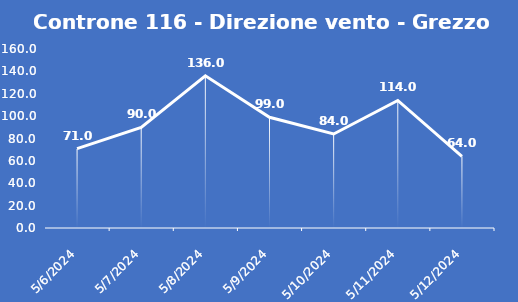
| Category | Controne 116 - Direzione vento - Grezzo (°N) |
|---|---|
| 5/6/24 | 71 |
| 5/7/24 | 90 |
| 5/8/24 | 136 |
| 5/9/24 | 99 |
| 5/10/24 | 84 |
| 5/11/24 | 114 |
| 5/12/24 | 64 |